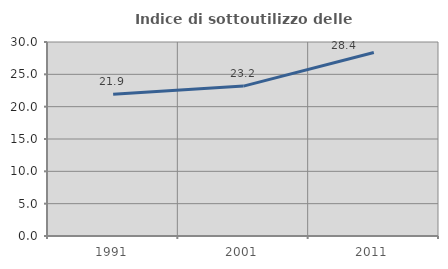
| Category | Indice di sottoutilizzo delle abitazioni  |
|---|---|
| 1991.0 | 21.91 |
| 2001.0 | 23.183 |
| 2011.0 | 28.387 |